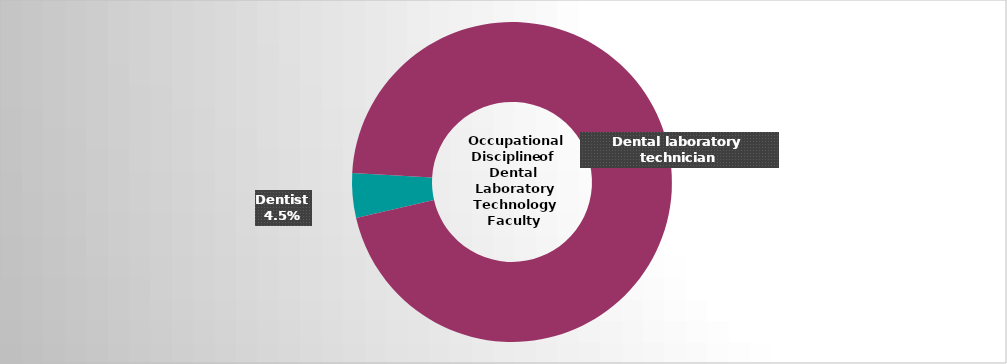
| Category | Series 2 |
|---|---|
| Both dental laboratory technician and dental assistant | 0 |
| Dentist | 0.045 |
| Dental laboratory technician | 0.955 |
| Both dental hygienist and dental assistant | 0 |